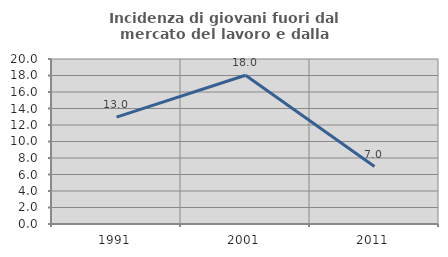
| Category | Incidenza di giovani fuori dal mercato del lavoro e dalla formazione  |
|---|---|
| 1991.0 | 12.957 |
| 2001.0 | 18.029 |
| 2011.0 | 6.959 |